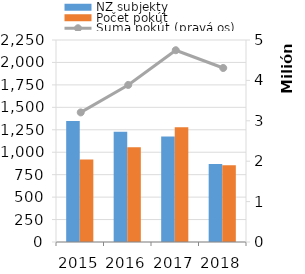
| Category | NZ subjekty | Počet pokút |
|---|---|---|
| 2015.0 | 1347 | 919 |
| 2016.0 | 1228 | 1055 |
| 2017.0 | 1174 | 1279 |
| 2018.0 | 869 | 856 |